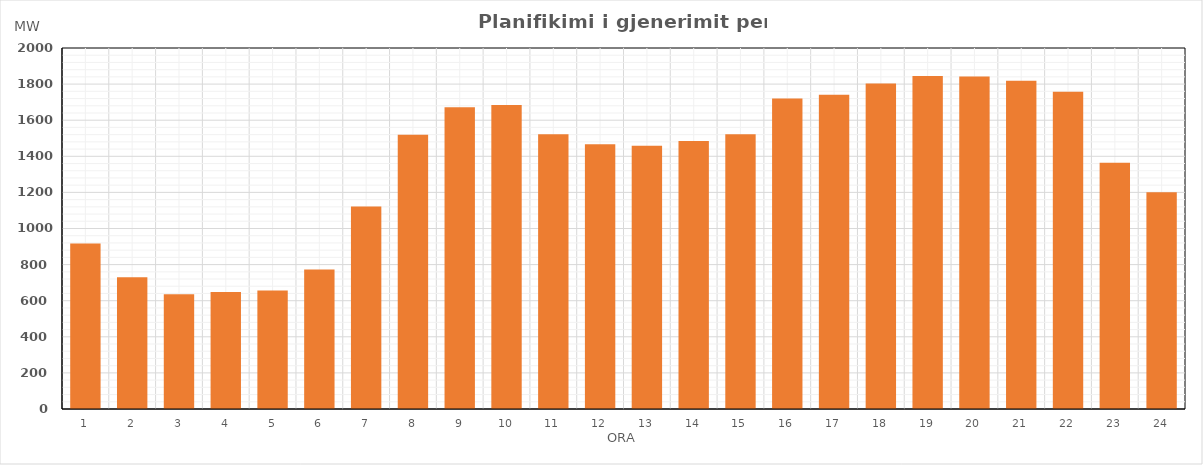
| Category | Max (MW) |
|---|---|
| 0 | 916.712 |
| 1 | 729.561 |
| 2 | 635.248 |
| 3 | 647.901 |
| 4 | 656.4 |
| 5 | 773.43 |
| 6 | 1121.69 |
| 7 | 1519.256 |
| 8 | 1671.193 |
| 9 | 1684.066 |
| 10 | 1522.241 |
| 11 | 1466.163 |
| 12 | 1458.151 |
| 13 | 1485.149 |
| 14 | 1522.838 |
| 15 | 1720.534 |
| 16 | 1741.006 |
| 17 | 1803.102 |
| 18 | 1844.675 |
| 19 | 1842.514 |
| 20 | 1819.228 |
| 21 | 1757.02 |
| 22 | 1364.42 |
| 23 | 1201.507 |